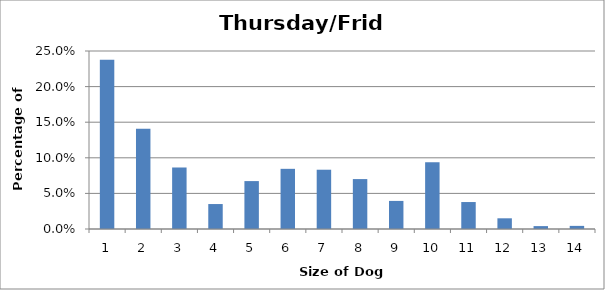
| Category | Series 0 |
|---|---|
| 0 | 0.238 |
| 1 | 0.141 |
| 2 | 0.086 |
| 3 | 0.035 |
| 4 | 0.067 |
| 5 | 0.085 |
| 6 | 0.083 |
| 7 | 0.07 |
| 8 | 0.039 |
| 9 | 0.094 |
| 10 | 0.038 |
| 11 | 0.015 |
| 12 | 0.004 |
| 13 | 0.004 |